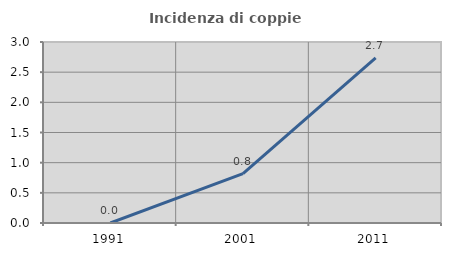
| Category | Incidenza di coppie miste |
|---|---|
| 1991.0 | 0 |
| 2001.0 | 0.82 |
| 2011.0 | 2.735 |